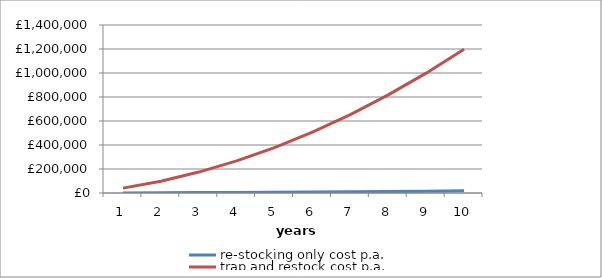
| Category | re-stocking only cost p.a. | trap and restock cost p.a. |
|---|---|---|
| 0 | 958.904 | 40512.497 |
| 1 | 2109.589 | 98639.124 |
| 2 | 3452.055 | 174379.879 |
| 3 | 4986.301 | 267734.764 |
| 4 | 6712.329 | 378703.778 |
| 5 | 8630.137 | 507286.922 |
| 6 | 10739.726 | 653484.194 |
| 7 | 13041.096 | 817295.596 |
| 8 | 15534.247 | 998721.127 |
| 9 | 18219.178 | 1197760.787 |